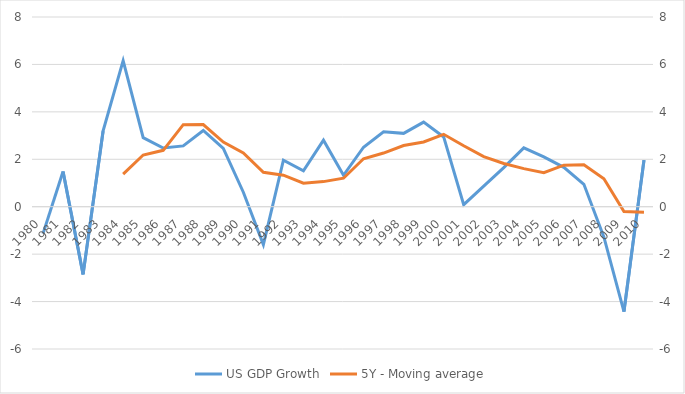
| Category | US GDP Growth |
|---|---|
| 1980.0 | -1.135 |
| 1981.0 | 1.486 |
| 1982.0 | -2.853 |
| 1983.0 | 3.196 |
| 1984.0 | 6.162 |
| 1985.0 | 2.912 |
| 1986.0 | 2.473 |
| 1987.0 | 2.564 |
| 1988.0 | 3.215 |
| 1989.0 | 2.458 |
| 1990.0 | 0.611 |
| 1991.0 | -1.598 |
| 1992.0 | 1.961 |
| 1993.0 | 1.514 |
| 1994.0 | 2.806 |
| 1995.0 | 1.326 |
| 1996.0 | 2.508 |
| 1997.0 | 3.16 |
| 1998.0 | 3.093 |
| 1999.0 | 3.566 |
| 2000.0 | 2.942 |
| 2001.0 | 0.084 |
| 2002.0 | 0.869 |
| 2003.0 | 1.65 |
| 2004.0 | 2.484 |
| 2005.0 | 2.103 |
| 2006.0 | 1.659 |
| 2007.0 | 0.944 |
| 2008.0 | -1.283 |
| 2009.0 | -4.425 |
| 2010.0 | 1.963 |